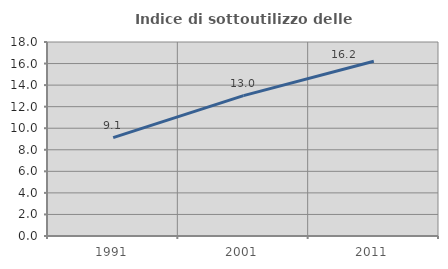
| Category | Indice di sottoutilizzo delle abitazioni  |
|---|---|
| 1991.0 | 9.134 |
| 2001.0 | 13.026 |
| 2011.0 | 16.219 |